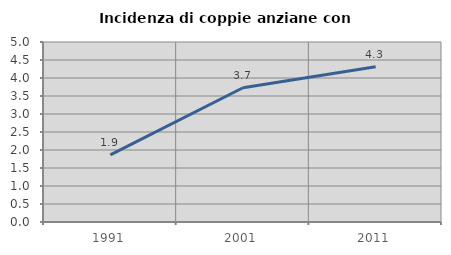
| Category | Incidenza di coppie anziane con figli |
|---|---|
| 1991.0 | 1.863 |
| 2001.0 | 3.729 |
| 2011.0 | 4.314 |